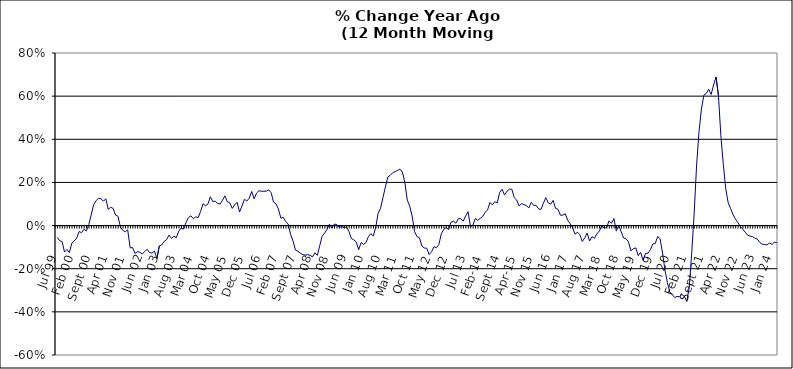
| Category | Series 0 |
|---|---|
| Jul 99 | -0.055 |
| Aug 99 | -0.07 |
| Sep 99 | -0.074 |
| Oct 99 | -0.123 |
| Nov 99 | -0.111 |
| Dec 99 | -0.125 |
| Jan 00 | -0.082 |
| Feb 00 | -0.071 |
| Mar 00 | -0.058 |
| Apr 00 | -0.027 |
| May 00 | -0.033 |
| Jun 00 | -0.017 |
| Jul 00 | -0.025 |
| Aug 00 | 0.005 |
| Sep 00 | 0.05 |
| Oct 00 | 0.098 |
| Nov 00 | 0.116 |
| Dec 00 | 0.127 |
| Jan 01 | 0.124 |
| Feb 01 | 0.113 |
| Mar 01 | 0.124 |
| Apr 01 | 0.075 |
| May 01 | 0.085 |
| Jun 01 | 0.08 |
| Jul 01 | 0.048 |
| Aug 01 | 0.043 |
| Sep 01 | -0.007 |
| Oct 01 | -0.022 |
| Nov 01 | -0.029 |
| Dec 01 | -0.02 |
| Jan 02 | -0.103 |
| Feb 02 | -0.102 |
| Mar 02 | -0.129 |
| Apr 02 | -0.121 |
| May 02 | -0.124 |
| Jun 02 | -0.132 |
| Jul 02 | -0.119 |
| Aug 02 | -0.11 |
| Sep 02 | -0.125 |
| Oct 02 | -0.128 |
| Nov 02 | -0.118 |
| Dec 02 | -0.153 |
| Jan 03 | -0.094 |
| Feb 03 | -0.09 |
| Mar 03 | -0.073 |
| Apr 03 | -0.065 |
| May 03 | -0.044 |
| Jun 03 | -0.06 |
| Jul 03 | -0.049 |
| Aug 03 | -0.056 |
| Sep 03 | -0.026 |
| Oct 03 | -0.012 |
| Nov 03 | -0.016 |
| Dec 03 | 0.014 |
| Jan 04 | 0.038 |
| Feb 04 | 0.045 |
| Mar 04 | 0.032 |
| Apr 04 | 0.041 |
| May 04 | 0.037 |
| Jun 04 | 0.066 |
| Jul 04 | 0.101 |
| Aug 04 | 0.092 |
| Sep 04 | 0.1 |
| Oct 04 | 0.133 |
| Nov 04 | 0.111 |
| Dec 04 | 0.113 |
| Jan 05 | 0.103 |
| Feb 05 | 0.1 |
| Mar 05 | 0.118 |
| Apr 05 | 0.138 |
| May 05 | 0.11 |
| Jun 05 | 0.106 |
| Jul 05 | 0.079 |
| Aug 05 | 0.097 |
| Sep 05 | 0.108 |
| Oct 05 | 0.063 |
| Nov 05 | 0.09 |
| Dec 05 | 0.122 |
| Jan 06 | 0.114 |
| Feb 06 | 0.127 |
| Mar 06 | 0.158 |
| Apr 06 | 0.124 |
| May 06 | 0.151 |
| Jun 06 | 0.162 |
| Jul 06 | 0.159 |
| Aug 06 | 0.159 |
| Sep 06 | 0.16 |
| Oct 06 | 0.166 |
| Nov 06 | 0.152 |
| Dec 06 | 0.109 |
| Jan 07 | 0.101 |
| Feb 07 | 0.076 |
| Mar 07 | 0.034 |
| Apr 07 | 0.038 |
| May 07 | 0.019 |
| Jun 07 | 0.007 |
| Jul 07 | -0.041 |
| Aug 07 | -0.071 |
| Sep 07 | -0.113 |
| Oct 07 | -0.12 |
| Nov 07 | -0.128 |
| Dec 07 | -0.135 |
| Jan 08 | -0.137 |
| Feb 08 | -0.135 |
| Mar 08 | -0.137 |
| Apr 08 | -0.145 |
| May 08 | -0.126 |
| Jun 08 | -0.138 |
| Jul 08 | -0.093 |
| Aug 08 | -0.049 |
| Sep-08 | -0.035 |
| Oct 08 | -0.018 |
| Nov 08 | 0.007 |
| Dec 08 | -0.011 |
| Jan 09 | 0.007 |
| Feb 09 | 0.005 |
| Mar 09 | -0.009 |
| Apr 09 | -0.003 |
| May 09 | -0.01 |
| Jun 09 | -0.007 |
| Jul 09 | -0.027 |
| Aug 09 | -0.06 |
| Sep 09 | -0.066 |
| Oct 09 | -0.076 |
| Nov 09 | -0.112 |
| Dec 09 | -0.079 |
| Jan 10 | -0.087 |
| Feb 10 | -0.079 |
| Mar 10 | -0.052 |
| Apr 10 | -0.037 |
| May 10 | -0.048 |
| Jun 10 | -0.01 |
| Jul 10 | 0.057 |
| Aug 10 | 0.08 |
| Sep 10 | 0.13 |
| Oct 10 | 0.179 |
| Nov 10 | 0.226 |
| Dec 10 | 0.233 |
| Jan 11 | 0.245 |
| Feb 11 | 0.25 |
| Mar 11 | 0.255 |
| Apr 11 | 0.262 |
| May 11 | 0.248 |
| Jun 11 | 0.199 |
| Jul 11 | 0.118 |
| Aug 11 | 0.09 |
| Sep 11 | 0.044 |
| Oct 11 | -0.028 |
| Nov 11 | -0.051 |
| Dec 11 | -0.056 |
| Jan 12 | -0.094 |
| Feb 12 | -0.104 |
| Mar 12 | -0.105 |
| Apr 12 | -0.134 |
| May 12 | -0.121 |
| Jun 12 | -0.098 |
| Jul 12 | -0.103 |
| Aug 12 | -0.087 |
| Sep 12 | -0.038 |
| Oct 12 | -0.018 |
| Nov 12 | -0.009 |
| Dec 12 | -0.019 |
| Jan 13 | 0.016 |
| Feb-13 | 0.02 |
| Mar-13 | 0.011 |
| Apr 13 | 0.032 |
| May 13 | 0.032 |
| Jun-13 | 0.021 |
| Jul 13 | 0.045 |
| Aug 13 | 0.065 |
| Sep 13 | -0.005 |
| Oct 13 | 0.002 |
| Nov 13 | 0.033 |
| Dec 13 | 0.024 |
| Jan 14 | 0.034 |
| Feb-14 | 0.042 |
| Mar 14 | 0.061 |
| Apr 14 | 0.072 |
| May 14 | 0.107 |
| Jun 14 | 0.097 |
| Jul-14 | 0.111 |
| Aug-14 | 0.105 |
| Sep 14 | 0.153 |
| Oct 14 | 0.169 |
| Nov 14 | 0.141 |
| Dec 14 | 0.159 |
| Jan 15 | 0.169 |
| Feb 15 | 0.169 |
| Mar 15 | 0.129 |
| Apr-15 | 0.118 |
| May 15 | 0.091 |
| Jun-15 | 0.102 |
| Jul 15 | 0.097 |
| Aug 15 | 0.092 |
| Sep 15 | 0.082 |
| Oct 15 | 0.108 |
| Nov 15 | 0.093 |
| Dec 15 | 0.094 |
| Jan 16 | 0.078 |
| Feb 16 | 0.075 |
| Mar 16 | 0.104 |
| Apr 16 | 0.129 |
| May 16 | 0.105 |
| Jun 16 | 0.1 |
| Jul 16 | 0.117 |
| Aug 16 | 0.08 |
| Sep 16 | 0.076 |
| Oct 16 | 0.048 |
| Nov 16 | 0.048 |
| Dec 16 | 0.055 |
| Jan 17 | 0.025 |
| Feb 17 | 0.009 |
| Mar 17 | -0.01 |
| Apr 17 | -0.04 |
| May 17 | -0.031 |
| Jun 17 | -0.042 |
| Jul 17 | -0.074 |
| Aug 17 | -0.057 |
| Sep 17 | -0.035 |
| Oct 17 | -0.071 |
| Nov 17 | -0.052 |
| Dec 17 | -0.059 |
| Jan 18 | -0.037 |
| Feb 18 | -0.027 |
| Mar 18 | 0 |
| Apr 18 | -0.012 |
| May 18 | -0.009 |
| Jun 18 | 0.022 |
| Jul 18 | 0.01 |
| Aug 18 | 0.033 |
| Sep 18 | -0.025 |
| Oct 18 | 0.002 |
| Nov 18 | -0.029 |
| Dec 18 | -0.058 |
| Jan 19 | -0.061 |
| Feb 19 | -0.075 |
| Mar 19 | -0.117 |
| Apr 19 | -0.107 |
| May 19 | -0.104 |
| Jun 19 | -0.139 |
| Jul 19 | -0.124 |
| Aug 19 | -0.16 |
| Sep 19 | -0.129 |
| Oct 19 | -0.128 |
| Nov 19 | -0.112 |
| Dec 19 | -0.085 |
| Jan 20 | -0.083 |
| Feb 20 | -0.051 |
| Mar 20 | -0.061 |
| Apr 20 | -0.127 |
| May 20 | -0.206 |
| Jun 20 | -0.264 |
| Jul 20 | -0.308 |
| Aug 20 | -0.32 |
| Sep 20 | -0.333 |
| Oct 20 | -0.329 |
| Nov 20 | -0.33 |
| Dec 20 | -0.319 |
| Jan 21 | -0.329 |
| Feb 21 | -0.352 |
| Mar 21 | -0.286 |
| Apr 21 | -0.129 |
| May 21 | 0.053 |
| Jun 21 | 0.276 |
| Jul 21 | 0.435 |
| Aug 21 | 0.541 |
| Sep 21 | 0.604 |
| Oct 21 | 0.613 |
| Nov 21 | 0.632 |
| Dec 21 | 0.608 |
| Jan 22 | 0.652 |
| Feb 22 | 0.689 |
| Mar 22 | 0.603 |
| Apr 22 | 0.416 |
| May 22 | 0.285 |
| Jun 22 | 0.171 |
| Jul 22 | 0.106 |
| Aug 22 | 0.079 |
| Sep 22 | 0.051 |
| Oct 22 | 0.03 |
| Nov 22 | 0.014 |
| Dec 22 | -0.004 |
| Jan 23 | -0.017 |
| Feb 23 | -0.031 |
| Mar 23 | -0.045 |
| Apr 23 | -0.049 |
| May 23 | -0.051 |
| Jun 23 | -0.058 |
| Jul 23 | -0.062 |
| Aug 23 | -0.078 |
| Sep 23 | -0.087 |
| Oct 23 | -0.087 |
| Nov 23 | -0.09 |
| Dec 23 | -0.081 |
| Jan 24 | -0.087 |
| Feb 24 | -0.078 |
| Mar 24 | -0.078 |